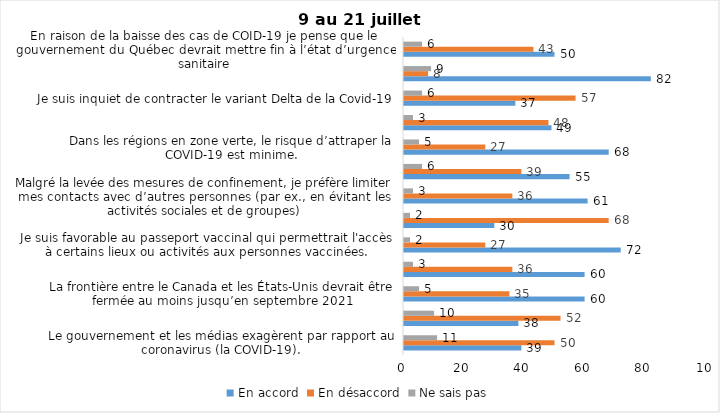
| Category | En accord | En désaccord | Ne sais pas |
|---|---|---|---|
| Le gouvernement et les médias exagèrent par rapport au coronavirus (la COVID-19). | 39 | 50 | 11 |
| J’ai peur que le système de santé soit débordé par les cas de COVID-19 suite au "déconfinement" | 38 | 52 | 10 |
| La frontière entre le Canada et les États-Unis devrait être fermée au moins jusqu’en septembre 2021 | 60 | 35 | 5 |
| Les personnes vaccinées contre la COVID-19 devraient avoir le droit de faire des rassemblements privés et de ne plus porter le masque dans les lieux publics. | 60 | 36 | 3 |
| Je suis favorable au passeport vaccinal qui permettrait l'accès à certains lieux ou activités aux personnes vaccinées. | 72 | 27 | 2 |
| Étant donné la progression de la vaccination et la diminution du nombre de cas de COVID-19, je pense qu’il est moins important de suivre les mesures de prévention. | 30 | 68 | 2 |
| Malgré la levée des mesures de confinement, je préfère limiter mes contacts avec d’autres personnes (par ex., en évitant les activités sociales et de groupes) | 61 | 36 | 3 |
| J’ai peur qu’il y ait une 4e vague de la COVID-19. | 55 | 39 | 6 |
| Dans les régions en zone verte, le risque d’attraper la COVID-19 est minime. | 68 | 27 | 5 |
| Si les cas de COVID-19 augmentent cet automne, je suis favorable à la mise en place de mesures de confinement (ex. fermeture de services non essentiels, interdiction des rassemblements privés) | 49 | 48 | 3 |
| Je suis inquiet de contracter le variant Delta de la Covid-19 | 37 | 57 | 6 |
| Je suis confiant que la vaccination protège efficacement contre les variants de la COVID-19 | 82 | 8 | 9 |
| En raison de la baisse des cas de COID-19 je pense que le gouvernement du Québec devrait mettre fin à l’état d’urgence sanitaire | 50 | 43 | 6 |